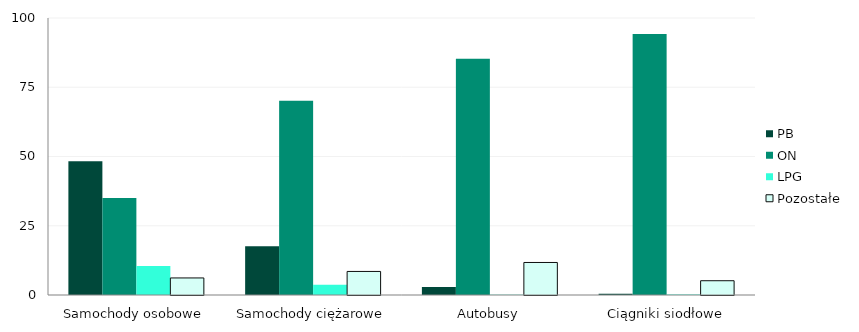
| Category | PB | ON | LPG | Pozostałe |
|---|---|---|---|---|
| 0 | 48.294 | 35.039 | 10.509 | 6.158 |
| 1 | 17.608 | 70.159 | 3.73 | 8.503 |
| 2 | 2.908 | 85.272 | 0.08 | 11.739 |
| 3 | 0.482 | 94.209 | 0.158 | 5.151 |